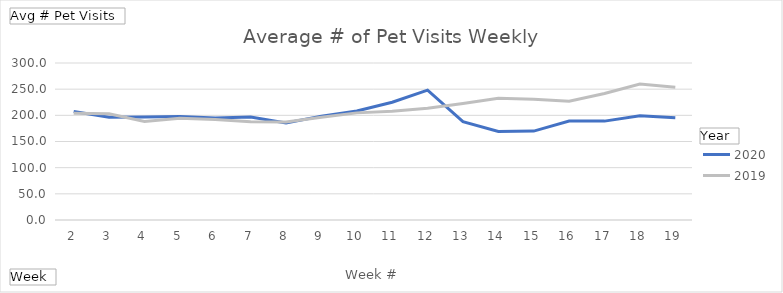
| Category | 2020 | 2019 |
|---|---|---|
| 2 | 207.333 | 204.162 |
| 3 | 196.314 | 202.943 |
| 4 | 196.6 | 188.448 |
| 5 | 197.981 | 194.229 |
| 6 | 195.01 | 192.267 |
| 7 | 196.933 | 187.648 |
| 8 | 185.486 | 187.057 |
| 9 | 198.438 | 196.362 |
| 10 | 208.305 | 204.695 |
| 11 | 225.105 | 207.657 |
| 12 | 248.067 | 213.638 |
| 13 | 187.924 | 222.429 |
| 14 | 169.276 | 232.686 |
| 15 | 169.923 | 230.81 |
| 16 | 189.255 | 226.933 |
| 17 | 188.961 | 241.781 |
| 18 | 199.16 | 259.743 |
| 19 | 195.333 | 253.752 |